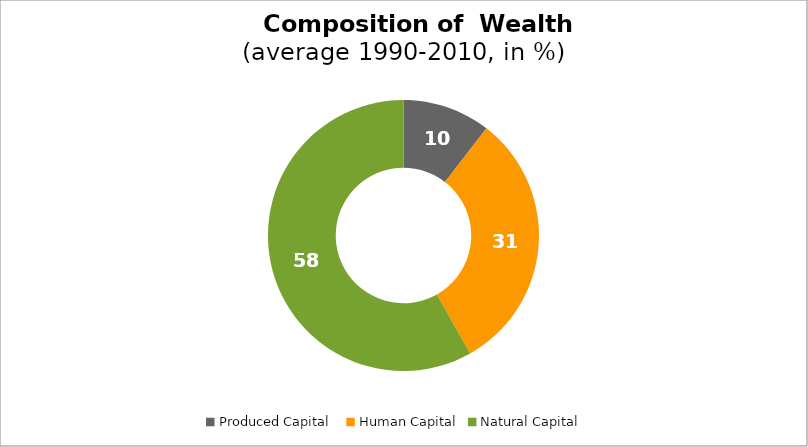
| Category | Series 0 |
|---|---|
| Produced Capital  | 10.487 |
| Human Capital | 31.326 |
| Natural Capital | 58.187 |